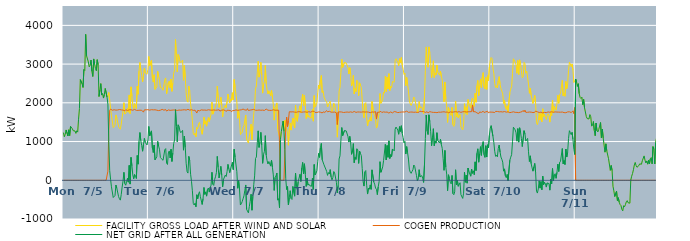
| Category | FACILITY GROSS LOAD AFTER WIND AND SOLAR | COGEN PRODUCTION | NET GRID AFTER ALL GENERATION |
|---|---|---|---|
|  Mon  7/5 | 1230 | 0 | 1230 |
|  Mon  7/5 | 1124 | 0 | 1124 |
|  Mon  7/5 | 1186 | 0 | 1186 |
|  Mon  7/5 | 1299 | 0 | 1299 |
|  Mon  7/5 | 1309 | 0 | 1309 |
|  Mon  7/5 | 1146 | 0 | 1146 |
|  Mon  7/5 | 1303 | 0 | 1303 |
|  Mon  7/5 | 1154 | 0 | 1154 |
|  Mon  7/5 | 1391 | 0 | 1391 |
|  Mon  7/5 | 1387 | 0 | 1387 |
|  Mon  7/5 | 1332 | 0 | 1332 |
|  Mon  7/5 | 1280 | 0 | 1280 |
|  Mon  7/5 | 1272 | 0 | 1272 |
|  Mon  7/5 | 1273 | 0 | 1273 |
|  Mon  7/5 | 1211 | 0 | 1211 |
|  Mon  7/5 | 1278 | 0 | 1278 |
|  Mon  7/5 | 1244 | 0 | 1244 |
|  Mon  7/5 | 1577 | 0 | 1577 |
|  Mon  7/5 | 1851 | 0 | 1851 |
|  Mon  7/5 | 2600 | 0 | 2600 |
|  Mon  7/5 | 2620 | 0 | 2620 |
|  Mon  7/5 | 2491 | 0 | 2491 |
|  Mon  7/5 | 2397 | 0 | 2397 |
|  Mon  7/5 | 2861 | 0 | 2861 |
|  Mon  7/5 | 2834 | 0 | 2834 |
|  Mon  7/5 | 3768 | 0 | 3768 |
|  Mon  7/5 | 3212 | 0 | 3212 |
|  Mon  7/5 | 3233 | 0 | 3233 |
|  Mon  7/5 | 3057 | 0 | 3057 |
|  Mon  7/5 | 2929 | 0 | 2929 |
|  Mon  7/5 | 2968 | 0 | 2968 |
|  Mon  7/5 | 3104 | 0 | 3104 |
|  Mon  7/5 | 2813 | 0 | 2813 |
|  Mon  7/5 | 2680 | 0 | 2680 |
|  Mon  7/5 | 3133 | 0 | 3133 |
|  Mon  7/5 | 3008 | 0 | 3008 |
|  Mon  7/5 | 2887 | 0 | 2887 |
|  Mon  7/5 | 2830 | 0 | 2830 |
|  Mon  7/5 | 3113 | 0 | 3113 |
|  Mon  7/5 | 2987 | 0 | 2987 |
|  Mon  7/5 | 2163 | 0 | 2163 |
|  Mon  7/5 | 2330 | 0 | 2330 |
|  Mon  7/5 | 2496 | 0 | 2496 |
|  Mon  7/5 | 2200 | 0 | 2200 |
|  Mon  7/5 | 2241 | 0 | 2241 |
|  Mon  7/5 | 2123 | 0 | 2123 |
|  Mon  7/5 | 2217 | 0 | 2217 |
|  Mon  7/5 | 2370 | 0 | 2370 |
|  Mon  7/5 | 2366 | 0 | 2366 |
|  Mon  7/5 | 2147 | 0 | 2147 |
|  Mon  7/5 | 2202 | 235 | 1967 |
|  Mon  7/5 | 2267 | 1281 | 986 |
|  Mon  7/5 | 2064 | 1810 | 254 |
|  Mon  7/5 | 1864 | 1837 | 27 |
|  Mon  7/5 | 1663 | 1832 | -169 |
|  Mon  7/5 | 1661 | 1808 | -147 |
|  Mon  7/5 | 1360 | 1805 | -445 |
|  Mon  7/5 | 1354 | 1821 | -467 |
|  Mon  7/5 | 1422 | 1814 | -392 |
|  Mon  7/5 | 1687 | 1811 | -124 |
|  Mon  7/5 | 1611 | 1815 | -204 |
|  Mon  7/5 | 1595 | 1815 | -220 |
|  Mon  7/5 | 1386 | 1807 | -421 |
|  Mon  7/5 | 1348 | 1827 | -479 |
|  Mon  7/5 | 1318 | 1831 | -513 |
|  Mon  7/5 | 1449 | 1817 | -368 |
|  Mon  7/5 | 1626 | 1802 | -176 |
|  Mon  7/5 | 1789 | 1812 | -23 |
|  Mon  7/5 | 2002 | 1797 | 205 |
|  Mon  7/5 | 1709 | 1794 | -85 |
|  Mon  7/5 | 1693 | 1821 | -128 |
|  Mon  7/5 | 1761 | 1810 | -49 |
|  Mon  7/5 | 1854 | 1804 | 50 |
|  Mon  7/5 | 1759 | 1808 | -49 |
|  Mon  7/5 | 2203 | 1818 | 385 |
|  Mon  7/5 | 1722 | 1821 | -99 |
|  Mon  7/5 | 2412 | 1821 | 591 |
|  Mon  7/5 | 2179 | 1805 | 374 |
|  Mon  7/5 | 1945 | 1808 | 137 |
|  Mon  7/5 | 1849 | 1810 | 39 |
|  Mon  7/5 | 1979 | 1829 | 150 |
|  Mon  7/5 | 1941 | 1821 | 120 |
|  Mon  7/5 | 1852 | 1806 | 46 |
|  Mon  7/5 | 2431 | 1791 | 640 |
|  Mon  7/5 | 2221 | 1805 | 416 |
|  Mon  7/5 | 2819 | 1817 | 1002 |
|  Mon  7/5 | 3042 | 1809 | 1233 |
|  Mon  7/5 | 2844 | 1820 | 1024 |
|  Mon  7/5 | 2704 | 1808 | 896 |
|  Mon  7/5 | 2540 | 1790 | 750 |
|  Mon  7/5 | 2688 | 1759 | 929 |
|  Mon  7/5 | 2899 | 1818 | 1081 |
|  Mon  7/5 | 2772 | 1796 | 976 |
|  Mon  7/5 | 2772 | 1819 | 953 |
|  Mon  7/5 | 2738 | 1826 | 912 |
|  Mon  7/5 | 2863 | 1823 | 1040 |
|  Tue  7/6 | 3196 | 1807 | 1389 |
|  Tue  7/6 | 2955 | 1811 | 1144 |
|  Tue  7/6 | 2956 | 1813 | 1143 |
|  Tue  7/6 | 3098 | 1823 | 1275 |
|  Tue  7/6 | 2636 | 1801 | 835 |
|  Tue  7/6 | 2534 | 1818 | 716 |
|  Tue  7/6 | 2724 | 1816 | 908 |
|  Tue  7/6 | 2346 | 1820 | 526 |
|  Tue  7/6 | 2359 | 1815 | 544 |
|  Tue  7/6 | 2415 | 1810 | 605 |
|  Tue  7/6 | 2813 | 1808 | 1005 |
|  Tue  7/6 | 2682 | 1800 | 882 |
|  Tue  7/6 | 2605 | 1803 | 802 |
|  Tue  7/6 | 2398 | 1809 | 589 |
|  Tue  7/6 | 2380 | 1820 | 560 |
|  Tue  7/6 | 2374 | 1831 | 543 |
|  Tue  7/6 | 2323 | 1807 | 516 |
|  Tue  7/6 | 2339 | 1810 | 529 |
|  Tue  7/6 | 2600 | 1810 | 790 |
|  Tue  7/6 | 2643 | 1826 | 817 |
|  Tue  7/6 | 2232 | 1787 | 445 |
|  Tue  7/6 | 2218 | 1810 | 408 |
|  Tue  7/6 | 2522 | 1817 | 705 |
|  Tue  7/6 | 2564 | 1807 | 757 |
|  Tue  7/6 | 2381 | 1805 | 576 |
|  Tue  7/6 | 2615 | 1814 | 801 |
|  Tue  7/6 | 2297 | 1811 | 486 |
|  Tue  7/6 | 2516 | 1808 | 708 |
|  Tue  7/6 | 2767 | 1815 | 952 |
|  Tue  7/6 | 2854 | 1814 | 1040 |
|  Tue  7/6 | 3635 | 1813 | 1822 |
|  Tue  7/6 | 3190 | 1796 | 1394 |
|  Tue  7/6 | 2798 | 1803 | 995 |
|  Tue  7/6 | 3251 | 1818 | 1433 |
|  Tue  7/6 | 3208 | 1814 | 1394 |
|  Tue  7/6 | 3074 | 1803 | 1271 |
|  Tue  7/6 | 3039 | 1810 | 1229 |
|  Tue  7/6 | 3067 | 1808 | 1259 |
|  Tue  7/6 | 3104 | 1816 | 1288 |
|  Tue  7/6 | 2581 | 1804 | 777 |
|  Tue  7/6 | 2963 | 1821 | 1142 |
|  Tue  7/6 | 2654 | 1808 | 846 |
|  Tue  7/6 | 2252 | 1812 | 440 |
|  Tue  7/6 | 2047 | 1820 | 227 |
|  Tue  7/6 | 2017 | 1832 | 185 |
|  Tue  7/6 | 2430 | 1813 | 617 |
|  Tue  7/6 | 2318 | 1811 | 507 |
|  Tue  7/6 | 1962 | 1806 | 156 |
|  Tue  7/6 | 1796 | 1822 | -26 |
|  Tue  7/6 | 1541 | 1812 | -271 |
|  Tue  7/6 | 1208 | 1805 | -597 |
|  Tue  7/6 | 1170 | 1809 | -639 |
|  Tue  7/6 | 1219 | 1810 | -591 |
|  Tue  7/6 | 1123 | 1808 | -685 |
|  Tue  7/6 | 1362 | 1736 | -374 |
|  Tue  7/6 | 1329 | 1806 | -477 |
|  Tue  7/6 | 1454 | 1808 | -354 |
|  Tue  7/6 | 1497 | 1793 | -296 |
|  Tue  7/6 | 1385 | 1809 | -424 |
|  Tue  7/6 | 1396 | 1818 | -422 |
|  Tue  7/6 | 1188 | 1812 | -624 |
|  Tue  7/6 | 1337 | 1812 | -475 |
|  Tue  7/6 | 1630 | 1816 | -186 |
|  Tue  7/6 | 1449 | 1813 | -364 |
|  Tue  7/6 | 1535 | 1834 | -299 |
|  Tue  7/6 | 1397 | 1807 | -410 |
|  Tue  7/6 | 1548 | 1784 | -236 |
|  Tue  7/6 | 1621 | 1821 | -200 |
|  Tue  7/6 | 1512 | 1817 | -305 |
|  Tue  7/6 | 1614 | 1813 | -199 |
|  Tue  7/6 | 1698 | 1824 | -126 |
|  Tue  7/6 | 2016 | 1810 | 206 |
|  Tue  7/6 | 1707 | 1810 | -103 |
|  Tue  7/6 | 1684 | 1816 | -132 |
|  Tue  7/6 | 1836 | 1817 | 19 |
|  Tue  7/6 | 1899 | 1809 | 90 |
|  Tue  7/6 | 2006 | 1809 | 197 |
|  Tue  7/6 | 2428 | 1812 | 616 |
|  Tue  7/6 | 2129 | 1798 | 331 |
|  Tue  7/6 | 1881 | 1821 | 60 |
|  Tue  7/6 | 1986 | 1786 | 200 |
|  Tue  7/6 | 2146 | 1786 | 360 |
|  Tue  7/6 | 1947 | 1810 | 137 |
|  Tue  7/6 | 1634 | 1805 | -171 |
|  Tue  7/6 | 1841 | 1817 | 24 |
|  Tue  7/6 | 1824 | 1807 | 17 |
|  Tue  7/6 | 1936 | 1802 | 134 |
|  Tue  7/6 | 1873 | 1776 | 97 |
|  Tue  7/6 | 2032 | 1809 | 223 |
|  Tue  7/6 | 2228 | 1818 | 410 |
|  Tue  7/6 | 2101 | 1806 | 295 |
|  Tue  7/6 | 1997 | 1800 | 197 |
|  Tue  7/6 | 2101 | 1801 | 300 |
|  Tue  7/6 | 2046 | 1769 | 277 |
|  Tue  7/6 | 2261 | 1798 | 463 |
|  Tue  7/6 | 2073 | 1798 | 275 |
|  Wed  7/7 | 2602 | 1801 | 801 |
|  Wed  7/7 | 2403 | 1805 | 598 |
|  Wed  7/7 | 2399 | 1817 | 582 |
|  Wed  7/7 | 2025 | 1804 | 221 |
|  Wed  7/7 | 1600 | 1806 | -206 |
|  Wed  7/7 | 1805 | 1809 | -4 |
|  Wed  7/7 | 1589 | 1814 | -225 |
|  Wed  7/7 | 1178 | 1816 | -638 |
|  Wed  7/7 | 1210 | 1818 | -608 |
|  Wed  7/7 | 1246 | 1797 | -551 |
|  Wed  7/7 | 1362 | 1839 | -477 |
|  Wed  7/7 | 1416 | 1817 | -401 |
|  Wed  7/7 | 1559 | 1816 | -257 |
|  Wed  7/7 | 1685 | 1806 | -121 |
|  Wed  7/7 | 1059 | 1810 | -751 |
|  Wed  7/7 | 1083 | 1849 | -766 |
|  Wed  7/7 | 960 | 1801 | -841 |
|  Wed  7/7 | 1123 | 1803 | -680 |
|  Wed  7/7 | 1265 | 1813 | -548 |
|  Wed  7/7 | 1447 | 1808 | -361 |
|  Wed  7/7 | 1047 | 1820 | -773 |
|  Wed  7/7 | 1396 | 1806 | -410 |
|  Wed  7/7 | 1716 | 1831 | -115 |
|  Wed  7/7 | 1921 | 1808 | 113 |
|  Wed  7/7 | 2372 | 1808 | 564 |
|  Wed  7/7 | 2432 | 1831 | 601 |
|  Wed  7/7 | 2774 | 1808 | 966 |
|  Wed  7/7 | 3071 | 1795 | 1276 |
|  Wed  7/7 | 2663 | 1814 | 849 |
|  Wed  7/7 | 2785 | 1801 | 984 |
|  Wed  7/7 | 3045 | 1808 | 1237 |
|  Wed  7/7 | 2719 | 1810 | 909 |
|  Wed  7/7 | 2250 | 1812 | 438 |
|  Wed  7/7 | 2477 | 1814 | 663 |
|  Wed  7/7 | 2552 | 1804 | 748 |
|  Wed  7/7 | 2963 | 1811 | 1152 |
|  Wed  7/7 | 2491 | 1839 | 652 |
|  Wed  7/7 | 2342 | 1831 | 511 |
|  Wed  7/7 | 2229 | 1809 | 420 |
|  Wed  7/7 | 2311 | 1826 | 485 |
|  Wed  7/7 | 2315 | 1805 | 510 |
|  Wed  7/7 | 2183 | 1817 | 366 |
|  Wed  7/7 | 2322 | 1805 | 517 |
|  Wed  7/7 | 2152 | 1815 | 337 |
|  Wed  7/7 | 1960 | 1821 | 139 |
|  Wed  7/7 | 1553 | 1815 | -262 |
|  Wed  7/7 | 1881 | 1809 | 72 |
|  Wed  7/7 | 1922 | 1811 | 111 |
|  Wed  7/7 | 1997 | 1809 | 188 |
|  Wed  7/7 | 1314 | 1827 | -513 |
|  Wed  7/7 | 1335 | 1809 | -474 |
|  Wed  7/7 | 1113 | 1823 | -710 |
|  Wed  7/7 | 1046 | 0 | 1046 |
|  Wed  7/7 | 1254 | 0 | 1254 |
|  Wed  7/7 | 1234 | 0 | 1234 |
|  Wed  7/7 | 1528 | 0 | 1528 |
|  Wed  7/7 | 1265 | 0 | 1265 |
|  Wed  7/7 | 1550 | 757 | 793 |
|  Wed  7/7 | 1413 | 1374 | 39 |
|  Wed  7/7 | 1392 | 1631 | -239 |
|  Wed  7/7 | 1223 | 1386 | -163 |
|  Wed  7/7 | 905 | 1543 | -638 |
|  Wed  7/7 | 1327 | 1770 | -443 |
|  Wed  7/7 | 1480 | 1750 | -270 |
|  Wed  7/7 | 1295 | 1765 | -470 |
|  Wed  7/7 | 1276 | 1772 | -496 |
|  Wed  7/7 | 1608 | 1768 | -160 |
|  Wed  7/7 | 1592 | 1772 | -180 |
|  Wed  7/7 | 1350 | 1760 | -410 |
|  Wed  7/7 | 1939 | 1754 | 185 |
|  Wed  7/7 | 1590 | 1756 | -166 |
|  Wed  7/7 | 1521 | 1758 | -237 |
|  Wed  7/7 | 1734 | 1770 | -36 |
|  Wed  7/7 | 1737 | 1767 | -30 |
|  Wed  7/7 | 1923 | 1769 | 154 |
|  Wed  7/7 | 1740 | 1769 | -29 |
|  Wed  7/7 | 2075 | 1757 | 318 |
|  Wed  7/7 | 2220 | 1758 | 462 |
|  Wed  7/7 | 1934 | 1764 | 170 |
|  Wed  7/7 | 2192 | 1766 | 426 |
|  Wed  7/7 | 1920 | 1766 | 154 |
|  Wed  7/7 | 1595 | 1754 | -159 |
|  Wed  7/7 | 1813 | 1756 | 57 |
|  Wed  7/7 | 1630 | 1756 | -126 |
|  Wed  7/7 | 1670 | 1770 | -100 |
|  Wed  7/7 | 1615 | 1755 | -140 |
|  Wed  7/7 | 1604 | 1758 | -154 |
|  Wed  7/7 | 1610 | 1765 | -155 |
|  Wed  7/7 | 1832 | 1782 | 50 |
|  Wed  7/7 | 1526 | 1759 | -233 |
|  Wed  7/7 | 2186 | 1779 | 407 |
|  Wed  7/7 | 1889 | 1752 | 137 |
|  Wed  7/7 | 1934 | 1756 | 178 |
|  Wed  7/7 | 1996 | 1751 | 245 |
|  Wed  7/7 | 2262 | 1769 | 493 |
|  Wed  7/7 | 2458 | 1765 | 693 |
|  Thu  7/8 | 2357 | 1766 | 591 |
|  Thu  7/8 | 2597 | 1757 | 840 |
|  Thu  7/8 | 2706 | 1755 | 951 |
|  Thu  7/8 | 2267 | 1739 | 528 |
|  Thu  7/8 | 2312 | 1765 | 547 |
|  Thu  7/8 | 2151 | 1751 | 400 |
|  Thu  7/8 | 2096 | 1754 | 342 |
|  Thu  7/8 | 2055 | 1766 | 289 |
|  Thu  7/8 | 2027 | 1799 | 228 |
|  Thu  7/8 | 1892 | 1766 | 126 |
|  Thu  7/8 | 1955 | 1756 | 199 |
|  Thu  7/8 | 1942 | 1781 | 161 |
|  Thu  7/8 | 2041 | 1766 | 275 |
|  Thu  7/8 | 1845 | 1759 | 86 |
|  Thu  7/8 | 1772 | 1761 | 11 |
|  Thu  7/8 | 1832 | 1758 | 74 |
|  Thu  7/8 | 1990 | 1764 | 226 |
|  Thu  7/8 | 1948 | 1761 | 187 |
|  Thu  7/8 | 1947 | 1771 | 176 |
|  Thu  7/8 | 1687 | 1743 | -56 |
|  Thu  7/8 | 1113 | 1440 | -327 |
|  Thu  7/8 | 1632 | 1764 | -132 |
|  Thu  7/8 | 2302 | 1752 | 550 |
|  Thu  7/8 | 2397 | 1766 | 631 |
|  Thu  7/8 | 2784 | 1758 | 1026 |
|  Thu  7/8 | 3123 | 1762 | 1361 |
|  Thu  7/8 | 2914 | 1763 | 1151 |
|  Thu  7/8 | 2921 | 1750 | 1171 |
|  Thu  7/8 | 3043 | 1759 | 1284 |
|  Thu  7/8 | 3028 | 1756 | 1272 |
|  Thu  7/8 | 3026 | 1752 | 1274 |
|  Thu  7/8 | 3022 | 1762 | 1260 |
|  Thu  7/8 | 2911 | 1783 | 1128 |
|  Thu  7/8 | 2743 | 1756 | 987 |
|  Thu  7/8 | 2906 | 1773 | 1133 |
|  Thu  7/8 | 2740 | 1766 | 974 |
|  Thu  7/8 | 2433 | 1763 | 670 |
|  Thu  7/8 | 2510 | 1754 | 756 |
|  Thu  7/8 | 2709 | 1762 | 947 |
|  Thu  7/8 | 2231 | 1777 | 454 |
|  Thu  7/8 | 2370 | 1774 | 596 |
|  Thu  7/8 | 2291 | 1753 | 538 |
|  Thu  7/8 | 2580 | 1767 | 813 |
|  Thu  7/8 | 2550 | 1764 | 786 |
|  Thu  7/8 | 2185 | 1749 | 436 |
|  Thu  7/8 | 2516 | 1762 | 754 |
|  Thu  7/8 | 2461 | 1770 | 691 |
|  Thu  7/8 | 2394 | 1759 | 635 |
|  Thu  7/8 | 2071 | 1764 | 307 |
|  Thu  7/8 | 1732 | 1767 | -35 |
|  Thu  7/8 | 1614 | 1764 | -150 |
|  Thu  7/8 | 1978 | 1761 | 217 |
|  Thu  7/8 | 2006 | 1755 | 251 |
|  Thu  7/8 | 1637 | 1765 | -128 |
|  Thu  7/8 | 1401 | 1757 | -356 |
|  Thu  7/8 | 1555 | 1760 | -205 |
|  Thu  7/8 | 1520 | 1752 | -232 |
|  Thu  7/8 | 1624 | 1744 | -120 |
|  Thu  7/8 | 1529 | 1763 | -234 |
|  Thu  7/8 | 2033 | 1764 | 269 |
|  Thu  7/8 | 2025 | 1763 | 262 |
|  Thu  7/8 | 1713 | 1759 | -46 |
|  Thu  7/8 | 1657 | 1758 | -101 |
|  Thu  7/8 | 1570 | 1772 | -202 |
|  Thu  7/8 | 1348 | 1580 | -232 |
|  Thu  7/8 | 1385 | 1755 | -370 |
|  Thu  7/8 | 1596 | 1762 | -166 |
|  Thu  7/8 | 1723 | 1757 | -34 |
|  Thu  7/8 | 2239 | 1759 | 480 |
|  Thu  7/8 | 1986 | 1780 | 206 |
|  Thu  7/8 | 2019 | 1750 | 269 |
|  Thu  7/8 | 2095 | 1750 | 345 |
|  Thu  7/8 | 2274 | 1766 | 508 |
|  Thu  7/8 | 2248 | 1757 | 491 |
|  Thu  7/8 | 2686 | 1758 | 928 |
|  Thu  7/8 | 2292 | 1767 | 525 |
|  Thu  7/8 | 2661 | 1762 | 899 |
|  Thu  7/8 | 2356 | 1763 | 593 |
|  Thu  7/8 | 2753 | 1735 | 1018 |
|  Thu  7/8 | 2315 | 1753 | 562 |
|  Thu  7/8 | 2428 | 1764 | 664 |
|  Thu  7/8 | 2389 | 1779 | 610 |
|  Thu  7/8 | 2549 | 1741 | 808 |
|  Thu  7/8 | 2556 | 1735 | 821 |
|  Thu  7/8 | 2533 | 1774 | 759 |
|  Thu  7/8 | 3090 | 1773 | 1317 |
|  Thu  7/8 | 3139 | 1765 | 1374 |
|  Thu  7/8 | 3130 | 1747 | 1383 |
|  Thu  7/8 | 3043 | 1747 | 1296 |
|  Thu  7/8 | 2956 | 1768 | 1188 |
|  Thu  7/8 | 3140 | 1755 | 1385 |
|  Thu  7/8 | 3029 | 1767 | 1262 |
|  Thu  7/8 | 3169 | 1761 | 1408 |
|  Thu  7/8 | 2971 | 1760 | 1211 |
|  Thu  7/8 | 2868 | 1764 | 1104 |
|  Thu  7/8 | 2732 | 1770 | 962 |
|  Fri  7/9 | 2770 | 1763 | 1007 |
|  Fri  7/9 | 2441 | 1763 | 678 |
|  Fri  7/9 | 2654 | 1785 | 869 |
|  Fri  7/9 | 2481 | 1769 | 712 |
|  Fri  7/9 | 2301 | 1754 | 547 |
|  Fri  7/9 | 2060 | 1773 | 287 |
|  Fri  7/9 | 1969 | 1761 | 208 |
|  Fri  7/9 | 1931 | 1752 | 179 |
|  Fri  7/9 | 1989 | 1762 | 227 |
|  Fri  7/9 | 2052 | 1781 | 271 |
|  Fri  7/9 | 2150 | 1756 | 394 |
|  Fri  7/9 | 2110 | 1751 | 359 |
|  Fri  7/9 | 2098 | 1759 | 339 |
|  Fri  7/9 | 1891 | 1765 | 126 |
|  Fri  7/9 | 1739 | 1753 | -14 |
|  Fri  7/9 | 1819 | 1772 | 47 |
|  Fri  7/9 | 2032 | 1759 | 273 |
|  Fri  7/9 | 1871 | 1785 | 86 |
|  Fri  7/9 | 1858 | 1761 | 97 |
|  Fri  7/9 | 1891 | 1771 | 120 |
|  Fri  7/9 | 1810 | 1759 | 51 |
|  Fri  7/9 | 1722 | 1777 | -55 |
|  Fri  7/9 | 2147 | 1756 | 391 |
|  Fri  7/9 | 2831 | 1750 | 1081 |
|  Fri  7/9 | 3443 | 1758 | 1685 |
|  Fri  7/9 | 3043 | 1771 | 1272 |
|  Fri  7/9 | 2919 | 1738 | 1181 |
|  Fri  7/9 | 3443 | 1753 | 1690 |
|  Fri  7/9 | 3288 | 1772 | 1516 |
|  Fri  7/9 | 3014 | 1763 | 1251 |
|  Fri  7/9 | 2652 | 1760 | 892 |
|  Fri  7/9 | 2868 | 1758 | 1110 |
|  Fri  7/9 | 3085 | 1753 | 1332 |
|  Fri  7/9 | 2654 | 1761 | 893 |
|  Fri  7/9 | 2767 | 1753 | 1014 |
|  Fri  7/9 | 2716 | 1757 | 959 |
|  Fri  7/9 | 2975 | 1747 | 1228 |
|  Fri  7/9 | 2791 | 1767 | 1024 |
|  Fri  7/9 | 2769 | 1759 | 1010 |
|  Fri  7/9 | 2712 | 1749 | 963 |
|  Fri  7/9 | 2816 | 1757 | 1059 |
|  Fri  7/9 | 2677 | 1754 | 923 |
|  Fri  7/9 | 2585 | 1764 | 821 |
|  Fri  7/9 | 2314 | 1758 | 556 |
|  Fri  7/9 | 2025 | 1768 | 257 |
|  Fri  7/9 | 2535 | 1765 | 770 |
|  Fri  7/9 | 2096 | 1758 | 338 |
|  Fri  7/9 | 1916 | 1757 | 159 |
|  Fri  7/9 | 1495 | 1764 | -269 |
|  Fri  7/9 | 1880 | 1738 | 142 |
|  Fri  7/9 | 1801 | 1756 | 45 |
|  Fri  7/9 | 1716 | 1767 | -51 |
|  Fri  7/9 | 1671 | 1763 | -92 |
|  Fri  7/9 | 1883 | 1758 | 125 |
|  Fri  7/9 | 1435 | 1779 | -344 |
|  Fri  7/9 | 1391 | 1764 | -373 |
|  Fri  7/9 | 1456 | 1756 | -300 |
|  Fri  7/9 | 2043 | 1772 | 271 |
|  Fri  7/9 | 1639 | 1760 | -121 |
|  Fri  7/9 | 1762 | 1761 | 1 |
|  Fri  7/9 | 1610 | 1766 | -156 |
|  Fri  7/9 | 1614 | 1771 | -157 |
|  Fri  7/9 | 1701 | 1764 | -63 |
|  Fri  7/9 | 1383 | 1754 | -371 |
|  Fri  7/9 | 1383 | 1753 | -370 |
|  Fri  7/9 | 1300 | 1768 | -468 |
|  Fri  7/9 | 1427 | 1760 | -333 |
|  Fri  7/9 | 1978 | 1772 | 206 |
|  Fri  7/9 | 1730 | 1782 | -52 |
|  Fri  7/9 | 1898 | 1762 | 136 |
|  Fri  7/9 | 1697 | 1772 | -75 |
|  Fri  7/9 | 2083 | 1767 | 316 |
|  Fri  7/9 | 1983 | 1760 | 223 |
|  Fri  7/9 | 1984 | 1770 | 214 |
|  Fri  7/9 | 1864 | 1759 | 105 |
|  Fri  7/9 | 2060 | 1772 | 288 |
|  Fri  7/9 | 2123 | 1945 | 178 |
|  Fri  7/9 | 2014 | 1769 | 245 |
|  Fri  7/9 | 1907 | 1763 | 144 |
|  Fri  7/9 | 2247 | 1771 | 476 |
|  Fri  7/9 | 2014 | 1764 | 250 |
|  Fri  7/9 | 2438 | 1740 | 698 |
|  Fri  7/9 | 2578 | 1765 | 813 |
|  Fri  7/9 | 2186 | 1719 | 467 |
|  Fri  7/9 | 2444 | 1763 | 681 |
|  Fri  7/9 | 2614 | 1746 | 868 |
|  Fri  7/9 | 2395 | 1753 | 642 |
|  Fri  7/9 | 2667 | 1756 | 911 |
|  Fri  7/9 | 2780 | 1782 | 998 |
|  Fri  7/9 | 2410 | 1750 | 660 |
|  Fri  7/9 | 2355 | 1763 | 592 |
|  Fri  7/9 | 2659 | 1766 | 893 |
|  Fri  7/9 | 2346 | 1746 | 600 |
|  Fri  7/9 | 2700 | 1783 | 917 |
|  Fri  7/9 | 2570 | 1735 | 835 |
|  Fri  7/9 | 2926 | 1763 | 1163 |
|  Sat  7/10 | 3101 | 1753 | 1348 |
|  Sat  7/10 | 3169 | 1759 | 1410 |
|  Sat  7/10 | 3142 | 1757 | 1385 |
|  Sat  7/10 | 2893 | 1758 | 1135 |
|  Sat  7/10 | 2760 | 1782 | 978 |
|  Sat  7/10 | 2499 | 1750 | 749 |
|  Sat  7/10 | 2397 | 1779 | 618 |
|  Sat  7/10 | 2441 | 1793 | 648 |
|  Sat  7/10 | 2382 | 1777 | 605 |
|  Sat  7/10 | 2576 | 1753 | 823 |
|  Sat  7/10 | 2676 | 1767 | 909 |
|  Sat  7/10 | 2476 | 1746 | 730 |
|  Sat  7/10 | 2369 | 1770 | 599 |
|  Sat  7/10 | 2304 | 1762 | 542 |
|  Sat  7/10 | 2231 | 1763 | 468 |
|  Sat  7/10 | 1982 | 1746 | 236 |
|  Sat  7/10 | 2069 | 1775 | 294 |
|  Sat  7/10 | 1886 | 1771 | 115 |
|  Sat  7/10 | 1826 | 1759 | 67 |
|  Sat  7/10 | 1927 | 1776 | 151 |
|  Sat  7/10 | 1756 | 1768 | -12 |
|  Sat  7/10 | 1755 | 1769 | -14 |
|  Sat  7/10 | 2266 | 1746 | 520 |
|  Sat  7/10 | 2356 | 1760 | 596 |
|  Sat  7/10 | 2416 | 1756 | 660 |
|  Sat  7/10 | 2754 | 1758 | 996 |
|  Sat  7/10 | 3138 | 1768 | 1370 |
|  Sat  7/10 | 3119 | 1749 | 1370 |
|  Sat  7/10 | 3055 | 1754 | 1301 |
|  Sat  7/10 | 2980 | 1755 | 1225 |
|  Sat  7/10 | 2763 | 1753 | 1010 |
|  Sat  7/10 | 3093 | 1759 | 1334 |
|  Sat  7/10 | 2732 | 1747 | 985 |
|  Sat  7/10 | 3110 | 1754 | 1356 |
|  Sat  7/10 | 3006 | 1760 | 1246 |
|  Sat  7/10 | 2838 | 1759 | 1079 |
|  Sat  7/10 | 2646 | 1775 | 871 |
|  Sat  7/10 | 2676 | 1804 | 872 |
|  Sat  7/10 | 3046 | 1766 | 1280 |
|  Sat  7/10 | 3011 | 1811 | 1200 |
|  Sat  7/10 | 2765 | 1754 | 1011 |
|  Sat  7/10 | 2819 | 1769 | 1050 |
|  Sat  7/10 | 2837 | 1756 | 1081 |
|  Sat  7/10 | 2488 | 1752 | 736 |
|  Sat  7/10 | 2246 | 1762 | 484 |
|  Sat  7/10 | 2383 | 1752 | 631 |
|  Sat  7/10 | 2188 | 1759 | 429 |
|  Sat  7/10 | 2087 | 1766 | 321 |
|  Sat  7/10 | 1983 | 1748 | 235 |
|  Sat  7/10 | 2098 | 1752 | 346 |
|  Sat  7/10 | 2192 | 1756 | 436 |
|  Sat  7/10 | 1983 | 1786 | 197 |
|  Sat  7/10 | 1485 | 1766 | -281 |
|  Sat  7/10 | 1437 | 1768 | -331 |
|  Sat  7/10 | 1538 | 1762 | -224 |
|  Sat  7/10 | 1734 | 1750 | -16 |
|  Sat  7/10 | 1559 | 1762 | -203 |
|  Sat  7/10 | 1726 | 1759 | -33 |
|  Sat  7/10 | 1510 | 1756 | -246 |
|  Sat  7/10 | 1846 | 1740 | 106 |
|  Sat  7/10 | 1640 | 1752 | -112 |
|  Sat  7/10 | 1701 | 1754 | -53 |
|  Sat  7/10 | 1684 | 1769 | -85 |
|  Sat  7/10 | 1570 | 1746 | -176 |
|  Sat  7/10 | 1679 | 1748 | -69 |
|  Sat  7/10 | 1718 | 1765 | -47 |
|  Sat  7/10 | 1681 | 1766 | -85 |
|  Sat  7/10 | 1502 | 1757 | -255 |
|  Sat  7/10 | 1772 | 1748 | 24 |
|  Sat  7/10 | 1673 | 1768 | -95 |
|  Sat  7/10 | 2071 | 1768 | 303 |
|  Sat  7/10 | 1745 | 1757 | -12 |
|  Sat  7/10 | 1910 | 1767 | 143 |
|  Sat  7/10 | 1935 | 1765 | 170 |
|  Sat  7/10 | 1808 | 1758 | 50 |
|  Sat  7/10 | 1966 | 1761 | 205 |
|  Sat  7/10 | 2195 | 1777 | 418 |
|  Sat  7/10 | 1987 | 1760 | 227 |
|  Sat  7/10 | 2207 | 1747 | 460 |
|  Sat  7/10 | 2250 | 1758 | 492 |
|  Sat  7/10 | 2228 | 1740 | 488 |
|  Sat  7/10 | 2581 | 1762 | 819 |
|  Sat  7/10 | 2179 | 1753 | 426 |
|  Sat  7/10 | 2257 | 1747 | 510 |
|  Sat  7/10 | 2166 | 1759 | 407 |
|  Sat  7/10 | 2550 | 1744 | 806 |
|  Sat  7/10 | 2366 | 1766 | 600 |
|  Sat  7/10 | 2487 | 1765 | 722 |
|  Sat  7/10 | 2832 | 1756 | 1076 |
|  Sat  7/10 | 3048 | 1768 | 1280 |
|  Sat  7/10 | 3002 | 1770 | 1232 |
|  Sat  7/10 | 2929 | 1750 | 1179 |
|  Sat  7/10 | 3004 | 1766 | 1238 |
|  Sat  7/10 | 2845 | 1788 | 1057 |
|  Sat  7/10 | 2523 | 1722 | 801 |
|  Sat  7/10 | 2543 | 1877 | 666 |
|  Sun  7/11 | 2615 | 0 | 2615 |
|  Sun  7/11 | 2545 | 0 | 2545 |
|  Sun  7/11 | 2424 | 0 | 2424 |
|  Sun  7/11 | 2492 | 0 | 2492 |
|  Sun  7/11 | 2236 | 0 | 2236 |
|  Sun  7/11 | 2139 | 0 | 2139 |
|  Sun  7/11 | 2113 | 0 | 2113 |
|  Sun  7/11 | 2145 | 0 | 2145 |
|  Sun  7/11 | 1952 | 0 | 1952 |
|  Sun  7/11 | 2088 | 0 | 2088 |
|  Sun  7/11 | 1873 | 0 | 1873 |
|  Sun  7/11 | 1863 | 0 | 1863 |
|  Sun  7/11 | 1646 | 0 | 1646 |
|  Sun  7/11 | 1593 | 0 | 1593 |
|  Sun  7/11 | 1609 | 0 | 1609 |
|  Sun  7/11 | 1583 | 0 | 1583 |
|  Sun  7/11 | 1696 | 0 | 1696 |
|  Sun  7/11 | 1641 | 0 | 1641 |
|  Sun  7/11 | 1397 | 0 | 1397 |
|  Sun  7/11 | 1424 | 0 | 1424 |
|  Sun  7/11 | 1516 | 0 | 1516 |
|  Sun  7/11 | 1283 | 0 | 1283 |
|  Sun  7/11 | 1151 | 0 | 1151 |
|  Sun  7/11 | 1478 | 0 | 1478 |
|  Sun  7/11 | 1277 | 0 | 1277 |
|  Sun  7/11 | 1249 | 0 | 1249 |
|  Sun  7/11 | 1314 | 0 | 1314 |
|  Sun  7/11 | 1399 | 0 | 1399 |
|  Sun  7/11 | 1491 | 0 | 1491 |
|  Sun  7/11 | 1094 | 0 | 1094 |
|  Sun  7/11 | 1323 | 0 | 1323 |
|  Sun  7/11 | 1094 | 0 | 1094 |
|  Sun  7/11 | 1094 | 0 | 1094 |
|  Sun  7/11 | 726 | 0 | 726 |
|  Sun  7/11 | 941 | 0 | 941 |
|  Sun  7/11 | 762 | 0 | 762 |
|  Sun  7/11 | 763 | 0 | 763 |
|  Sun  7/11 | 557 | 0 | 557 |
|  Sun  7/11 | 577 | 0 | 577 |
|  Sun  7/11 | 257 | 0 | 257 |
|  Sun  7/11 | 381 | 0 | 381 |
|  Sun  7/11 | 251 | 0 | 251 |
|  Sun  7/11 | -154 | 0 | -154 |
|  Sun  7/11 | -274 | 0 | -274 |
|  Sun  7/11 | -420 | 0 | -420 |
|  Sun  7/11 | -420 | 0 | -420 |
|  Sun  7/11 | -282 | 0 | -282 |
|  Sun  7/11 | -524 | 0 | -524 |
|  Sun  7/11 | -450 | 0 | -450 |
|  Sun  7/11 | -567 | 0 | -567 |
|  Sun  7/11 | -628 | 0 | -628 |
|  Sun  7/11 | -654 | 0 | -654 |
|  Sun  7/11 | -751 | 0 | -751 |
|  Sun  7/11 | -789 | 0 | -789 |
|  Sun  7/11 | -657 | 0 | -657 |
|  Sun  7/11 | -684 | 0 | -684 |
|  Sun  7/11 | -629 | 0 | -629 |
|  Sun  7/11 | -555 | 0 | -555 |
|  Sun  7/11 | -527 | 0 | -527 |
|  Sun  7/11 | -580 | 0 | -580 |
|  Sun  7/11 | -593 | 0 | -593 |
|  Sun  7/11 | -591 | 0 | -591 |
|  Sun  7/11 | 6 | 0 | 6 |
|  Sun  7/11 | 105 | 0 | 105 |
|  Sun  7/11 | 174 | 0 | 174 |
|  Sun  7/11 | 272 | 0 | 272 |
|  Sun  7/11 | 395 | 0 | 395 |
|  Sun  7/11 | 460 | 0 | 460 |
|  Sun  7/11 | 379 | 0 | 379 |
|  Sun  7/11 | 336 | 0 | 336 |
|  Sun  7/11 | 313 | 0 | 313 |
|  Sun  7/11 | 377 | 0 | 377 |
|  Sun  7/11 | 423 | 0 | 423 |
|  Sun  7/11 | 439 | 0 | 439 |
|  Sun  7/11 | 414 | 0 | 414 |
|  Sun  7/11 | 504 | 0 | 504 |
|  Sun  7/11 | 503 | 0 | 503 |
|  Sun  7/11 | 629 | 0 | 629 |
|  Sun  7/11 | 521 | 0 | 521 |
|  Sun  7/11 | 447 | 0 | 447 |
|  Sun  7/11 | 500 | 0 | 500 |
|  Sun  7/11 | 416 | 0 | 416 |
|  Sun  7/11 | 515 | 0 | 515 |
|  Sun  7/11 | 421 | 0 | 421 |
|  Sun  7/11 | 556 | 0 | 556 |
|  Sun  7/11 | 586 | 0 | 586 |
|  Sun  7/11 | 424 | 0 | 424 |
|  Sun  7/11 | 869 | 0 | 869 |
|  Sun  7/11 | 799 | 0 | 799 |
|  Sun  7/11 | 422 | 0 | 422 |
|  Sun  7/11 | 977 | 0 | 977 |
|  Sun  7/11 | 1094 | 0 | 1094 |